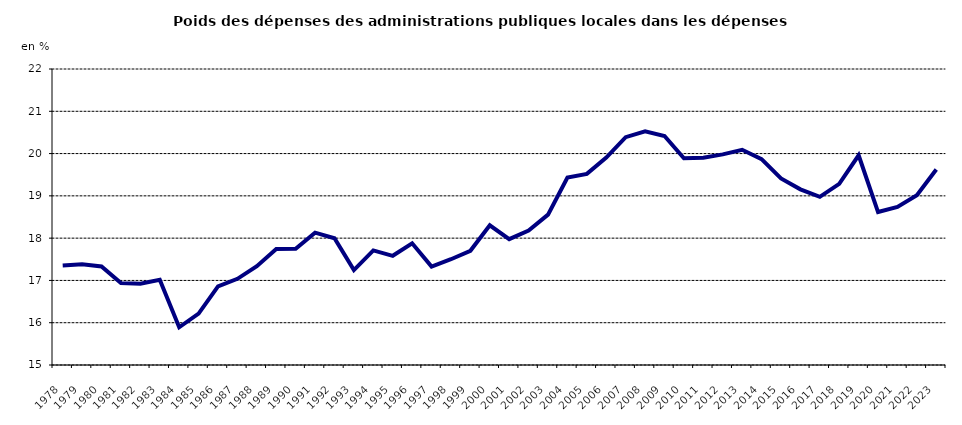
| Category | poids des dépenses des administarations publiques locales dans les administrations publiques |
|---|---|
| 1978.0 | 17.352 |
| 1979.0 | 17.38 |
| 1980.0 | 17.329 |
| 1981.0 | 16.941 |
| 1982.0 | 16.923 |
| 1983.0 | 17.017 |
| 1984.0 | 15.892 |
| 1985.0 | 16.214 |
| 1986.0 | 16.858 |
| 1987.0 | 17.038 |
| 1988.0 | 17.335 |
| 1989.0 | 17.742 |
| 1990.0 | 17.751 |
| 1991.0 | 18.13 |
| 1992.0 | 17.998 |
| 1993.0 | 17.244 |
| 1994.0 | 17.71 |
| 1995.0 | 17.582 |
| 1996.0 | 17.877 |
| 1997.0 | 17.327 |
| 1998.0 | 17.502 |
| 1999.0 | 17.701 |
| 2000.0 | 18.302 |
| 2001.0 | 17.976 |
| 2002.0 | 18.18 |
| 2003.0 | 18.555 |
| 2004.0 | 19.434 |
| 2005.0 | 19.52 |
| 2006.0 | 19.905 |
| 2007.0 | 20.388 |
| 2008.0 | 20.527 |
| 2009.0 | 20.416 |
| 2010.0 | 19.89 |
| 2011.0 | 19.903 |
| 2012.0 | 19.98 |
| 2013.0 | 20.089 |
| 2014.0 | 19.868 |
| 2015.0 | 19.413 |
| 2016.0 | 19.154 |
| 2017.0 | 18.977 |
| 2018.0 | 19.285 |
| 2019.0 | 19.96 |
| 2020.0 | 18.618 |
| 2021.0 | 18.737 |
| 2022.0 | 19.015 |
| 2023.0 | 19.622 |